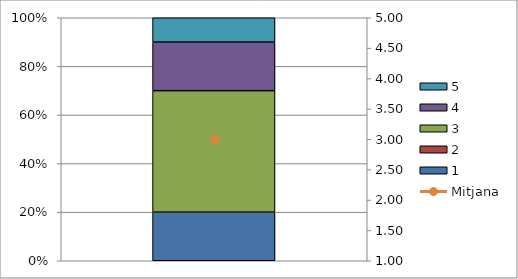
| Category | 1 | 2 | 3 | 4 | 5 |
|---|---|---|---|---|---|
| 0 | 2 | 0 | 5 | 2 | 1 |